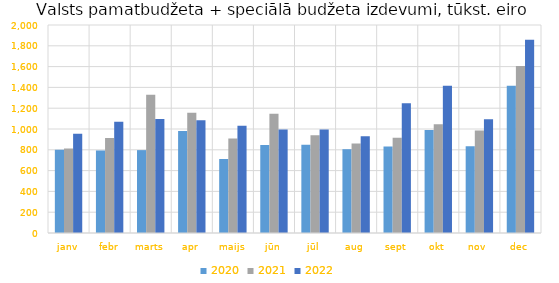
| Category | 2020 | 2021 | 2022 |
|---|---|---|---|
| janv | 800513.176 | 812540.784 | 954604.585 |
| febr | 793560.967 | 913452.191 | 1070533.109 |
| marts | 796946.618 | 1329058.335 | 1096177.665 |
| apr | 981781.839 | 1156902.965 | 1085060.388 |
| maijs | 711775.073 | 909621.75 | 1032376.247 |
| jūn | 846260.327 | 1146703.878 | 994027.105 |
| jūl | 848728.248 | 939467.851 | 994781.699 |
| aug | 805848.679 | 860719.856 | 929865.805 |
| sept | 832590.985 | 915890.517 | 1247630.19 |
| okt | 990572.907 | 1045656.477 | 1415572.01 |
| nov | 834311.145 | 984919.983 | 1092974.61 |
| dec | 1416800.012 | 1605011.589 | 1857192.044 |